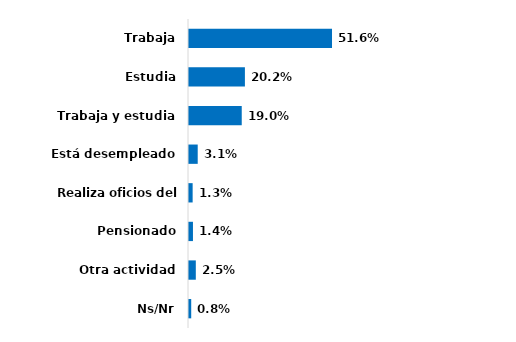
| Category | Series 0 |
|---|---|
| Trabaja | 0.516 |
| Estudia | 0.202 |
| Trabaja y estudia | 0.19 |
| Está desempleado | 0.031 |
| Realiza oficios del hogar | 0.013 |
| Pensionado | 0.014 |
| Otra actividad | 0.025 |
| Ns/Nr | 0.008 |